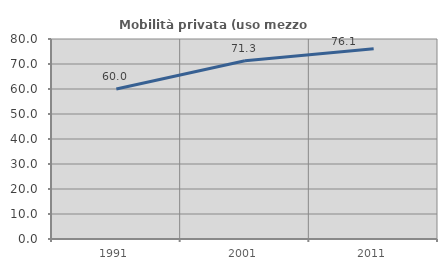
| Category | Mobilità privata (uso mezzo privato) |
|---|---|
| 1991.0 | 60 |
| 2001.0 | 71.264 |
| 2011.0 | 76.103 |